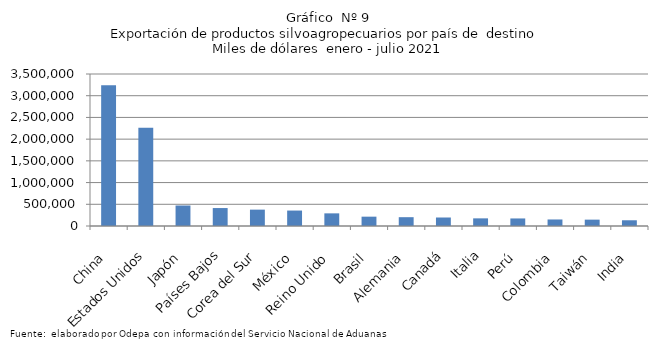
| Category | Series 0 |
|---|---|
| China | 3240100.964 |
| Estados Unidos | 2262723.147 |
| Japón | 471918.776 |
| Países Bajos | 413331.897 |
| Corea del Sur | 376804.978 |
| México | 355643.639 |
| Reino Unido | 291130.868 |
| Brasil | 214948.277 |
| Alemania | 203055.672 |
| Canadá | 195639.173 |
| Italia | 176076.762 |
| Perú | 173873.189 |
| Colombia | 150380.145 |
| Taiwán | 146379.275 |
| India | 131852.684 |